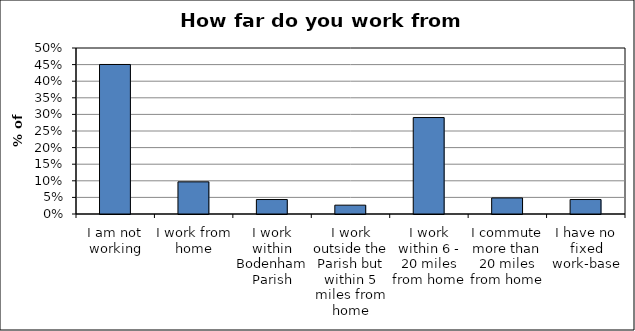
| Category | Series 0 |
|---|---|
| I am not working | 0.45 |
| I work from home | 0.097 |
| I work within Bodenham Parish | 0.044 |
| I work outside the Parish but within 5 miles from home | 0.027 |
| I work within 6 - 20 miles from home | 0.291 |
| I commute more than 20 miles from home | 0.048 |
| I have no fixed work-base | 0.044 |